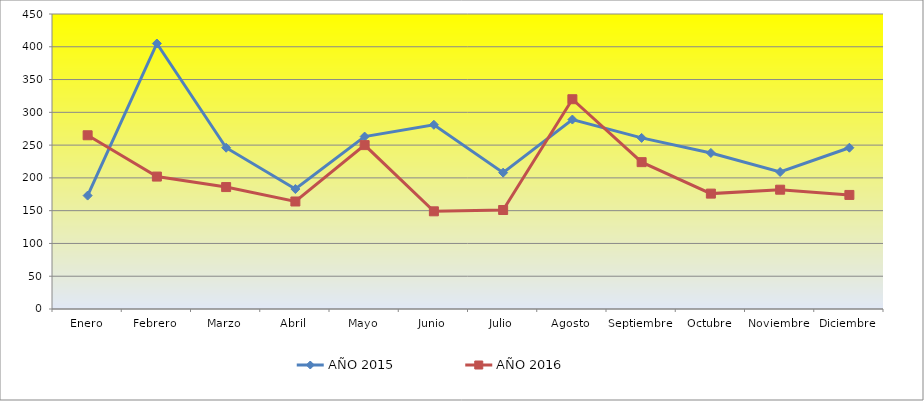
| Category | AÑO 2015 | AÑO 2016 |
|---|---|---|
| Enero | 173 | 265 |
| Febrero | 405 | 202 |
| Marzo | 246 | 186 |
| Abril | 183 | 164 |
| Mayo | 263 | 250 |
| Junio | 281 | 149 |
| Julio | 208 | 151 |
| Agosto | 289 | 320 |
| Septiembre | 261 | 224 |
| Octubre | 238 | 176 |
| Noviembre | 209 | 182 |
| Diciembre | 246 | 174 |